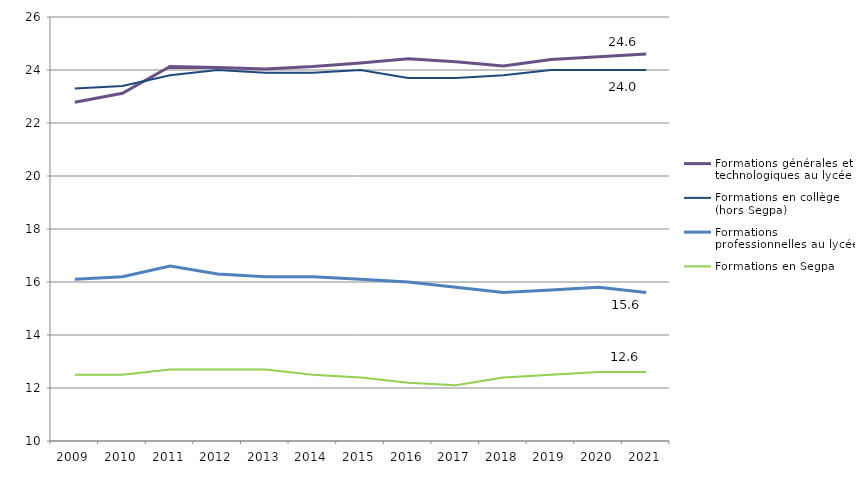
| Category | Formations générales et technologiques au lycée | Formations en collège (hors Segpa) | Formations professionnelles au lycée | Formations en Segpa |
|---|---|---|---|---|
| 2009.0 | 22.78 | 23.3 | 16.1 | 12.5 |
| 2010.0 | 23.12 | 23.4 | 16.2 | 12.5 |
| 2011.0 | 24.13 | 23.8 | 16.6 | 12.7 |
| 2012.0 | 24.09 | 24 | 16.3 | 12.7 |
| 2013.0 | 24.04 | 23.9 | 16.2 | 12.7 |
| 2014.0 | 24.13 | 23.9 | 16.2 | 12.5 |
| 2015.0 | 24.26 | 24 | 16.1 | 12.4 |
| 2016.0 | 24.42 | 23.7 | 16 | 12.2 |
| 2017.0 | 24.31 | 23.7 | 15.8 | 12.1 |
| 2018.0 | 24.15 | 23.8 | 15.6 | 12.4 |
| 2019.0 | 24.4 | 24 | 15.7 | 12.5 |
| 2020.0 | 24.5 | 24 | 15.8 | 12.6 |
| 2021.0 | 24.6 | 24 | 15.6 | 12.6 |